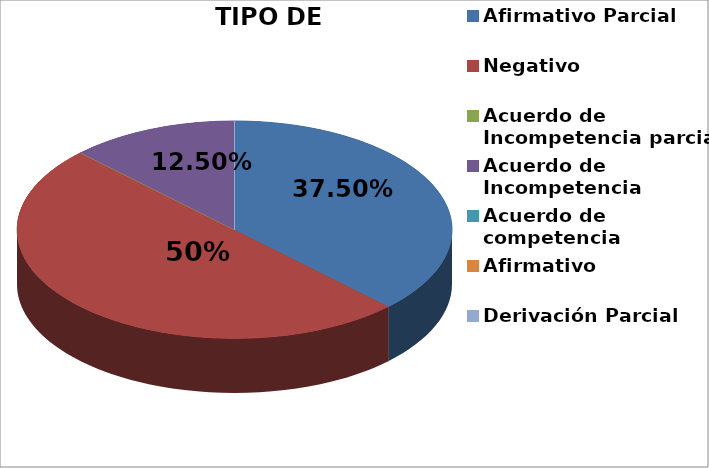
| Category | Series 0 |
|---|---|
| Afirmativo Parcial | 3 |
| Negativo | 4 |
| Acuerdo de Incompetencia parcial | 0 |
| Acuerdo de Incompetencia | 1 |
| Acuerdo de competencia | 0 |
| Afirmativo | 0 |
| Derivación Parcial | 0 |